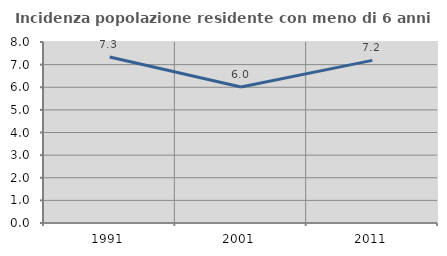
| Category | Incidenza popolazione residente con meno di 6 anni |
|---|---|
| 1991.0 | 7.337 |
| 2001.0 | 6.007 |
| 2011.0 | 7.188 |